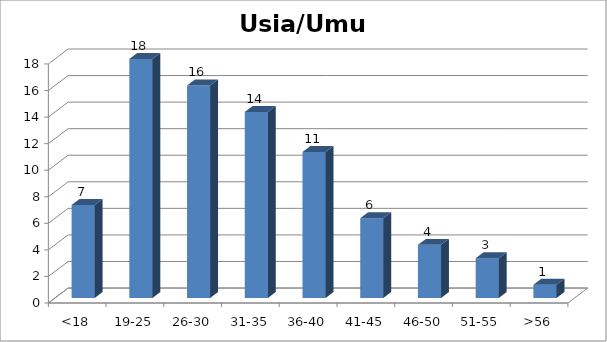
| Category | Usia/Umur |
|---|---|
| <18 | 7 |
| 19-25 | 18 |
| 26-30 | 16 |
| 31-35 | 14 |
| 36-40 | 11 |
| 41-45 | 6 |
| 46-50 | 4 |
| 51-55 | 3 |
| >56 | 1 |